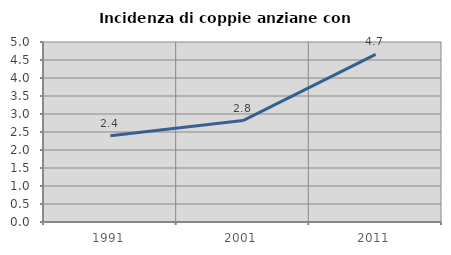
| Category | Incidenza di coppie anziane con figli |
|---|---|
| 1991.0 | 2.394 |
| 2001.0 | 2.817 |
| 2011.0 | 4.658 |